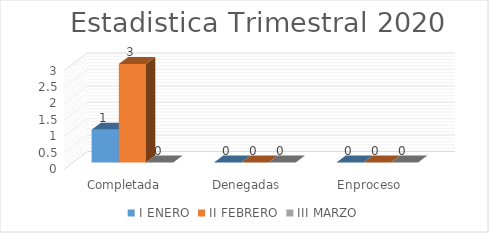
| Category | I ENERO | II FEBRERO | III MARZO |
|---|---|---|---|
| Completada | 1 | 3 | 0 |
| Denegadas | 0 | 0 | 0 |
| Enproceso | 0 | 0 | 0 |